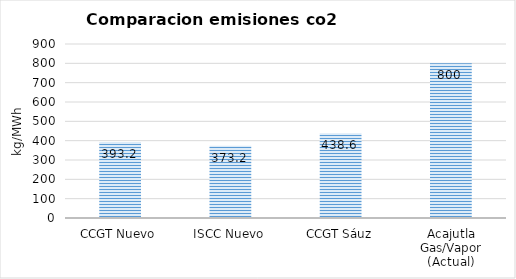
| Category | Series 0 |
|---|---|
| CCGT Nuevo | 393.2 |
| ISCC Nuevo | 373.2 |
| CCGT Sáuz | 438.6 |
| Acajutla Gas/Vapor (Actual) | 800 |